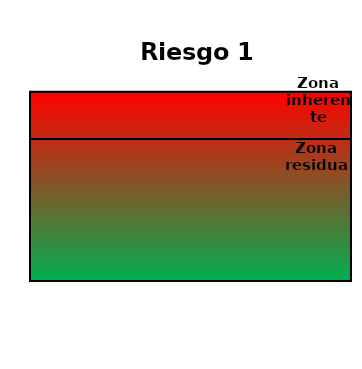
| Category | Zona  | Zona Residual | Zona inherente |
|---|---|---|---|
| Riesgo 1 | 4 | 3 | 4 |